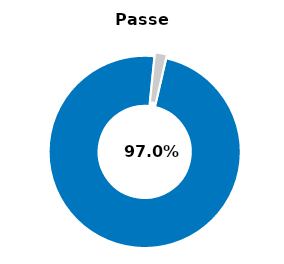
| Category | Series 0 |
|---|---|
| Passed | 0.98 |
| Other | 0.02 |